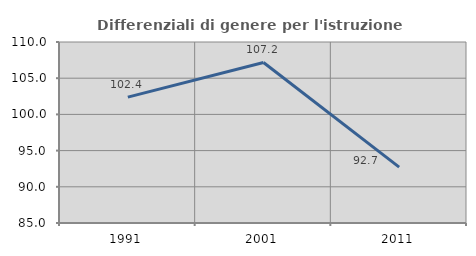
| Category | Differenziali di genere per l'istruzione superiore |
|---|---|
| 1991.0 | 102.385 |
| 2001.0 | 107.177 |
| 2011.0 | 92.71 |